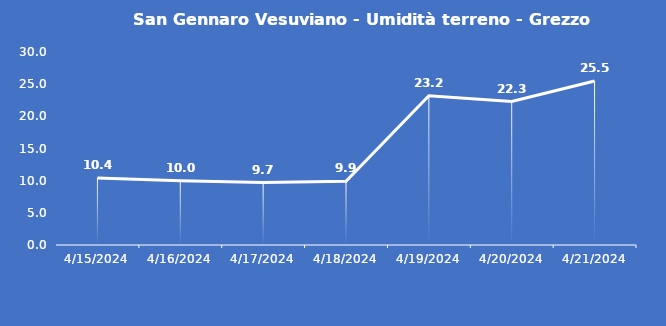
| Category | San Gennaro Vesuviano - Umidità terreno - Grezzo (%VWC) |
|---|---|
| 4/15/24 | 10.4 |
| 4/16/24 | 10 |
| 4/17/24 | 9.7 |
| 4/18/24 | 9.9 |
| 4/19/24 | 23.2 |
| 4/20/24 | 22.3 |
| 4/21/24 | 25.5 |